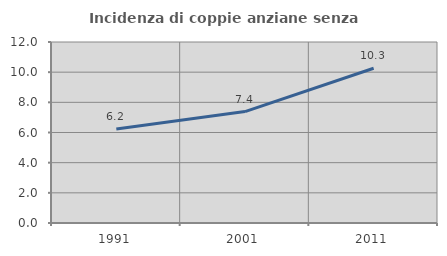
| Category | Incidenza di coppie anziane senza figli  |
|---|---|
| 1991.0 | 6.23 |
| 2001.0 | 7.389 |
| 2011.0 | 10.261 |